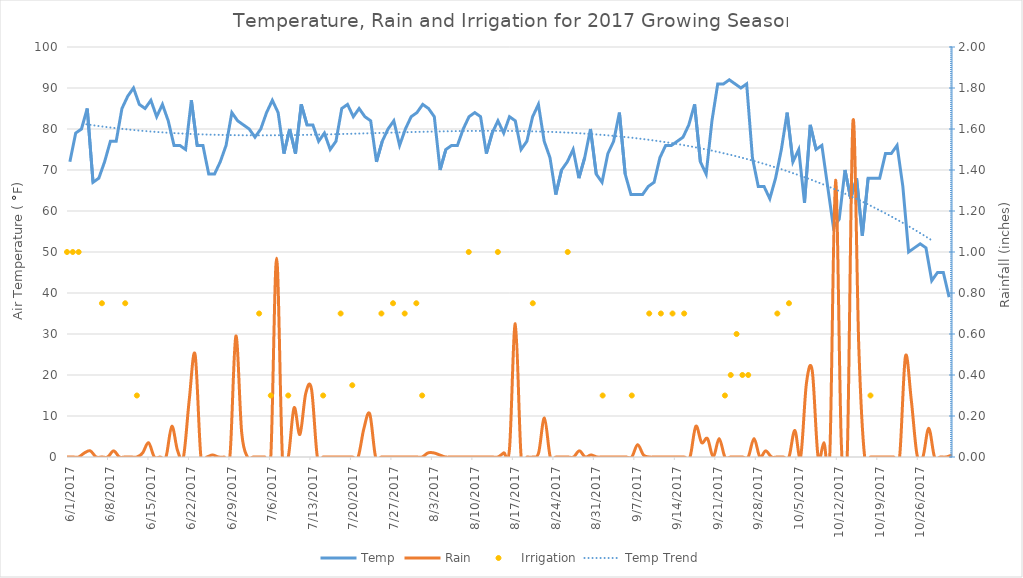
| Category | Temp |
|---|---|
| 6/1/17 | 72 |
| 6/2/17 | 79 |
| 6/3/17 | 80 |
| 6/4/17 | 85 |
| 6/5/17 | 67 |
| 6/6/17 | 68 |
| 6/7/17 | 72 |
| 6/8/17 | 77 |
| 6/9/17 | 77 |
| 6/10/17 | 85 |
| 6/11/17 | 88 |
| 6/12/17 | 90 |
| 6/13/17 | 86 |
| 6/14/17 | 85 |
| 6/15/17 | 87 |
| 6/16/17 | 83 |
| 6/17/17 | 86 |
| 6/18/17 | 82 |
| 6/19/17 | 76 |
| 6/20/17 | 76 |
| 6/21/17 | 75 |
| 6/22/17 | 87 |
| 6/23/17 | 76 |
| 6/24/17 | 76 |
| 6/25/17 | 69 |
| 6/26/17 | 69 |
| 6/27/17 | 72 |
| 6/28/17 | 76 |
| 6/29/17 | 84 |
| 6/30/17 | 82 |
| 7/1/17 | 81 |
| 7/2/17 | 80 |
| 7/3/17 | 78 |
| 7/4/17 | 80 |
| 7/5/17 | 84 |
| 7/6/17 | 87 |
| 7/7/17 | 84 |
| 7/8/17 | 74 |
| 7/9/17 | 80 |
| 7/10/17 | 74 |
| 7/11/17 | 86 |
| 7/12/17 | 81 |
| 7/13/17 | 81 |
| 7/14/17 | 77 |
| 7/15/17 | 79 |
| 7/16/17 | 75 |
| 7/17/17 | 77 |
| 7/18/17 | 85 |
| 7/19/17 | 86 |
| 7/20/17 | 83 |
| 7/21/17 | 85 |
| 7/22/17 | 83 |
| 7/23/17 | 82 |
| 7/24/17 | 72 |
| 7/25/17 | 77 |
| 7/26/17 | 80 |
| 7/27/17 | 82 |
| 7/28/17 | 76 |
| 7/29/17 | 80 |
| 7/30/17 | 83 |
| 7/31/17 | 84 |
| 8/1/17 | 86 |
| 8/2/17 | 85 |
| 8/3/17 | 83 |
| 8/4/17 | 70 |
| 8/5/17 | 75 |
| 8/6/17 | 76 |
| 8/7/17 | 76 |
| 8/8/17 | 80 |
| 8/9/17 | 83 |
| 8/10/17 | 84 |
| 8/11/17 | 83 |
| 8/12/17 | 74 |
| 8/13/17 | 79 |
| 8/14/17 | 82 |
| 8/15/17 | 79 |
| 8/16/17 | 83 |
| 8/17/17 | 82 |
| 8/18/17 | 75 |
| 8/19/17 | 77 |
| 8/20/17 | 83 |
| 8/21/17 | 86 |
| 8/22/17 | 77 |
| 8/23/17 | 73 |
| 8/24/17 | 64 |
| 8/25/17 | 70 |
| 8/26/17 | 72 |
| 8/27/17 | 75 |
| 8/28/17 | 68 |
| 8/29/17 | 73 |
| 8/30/17 | 80 |
| 8/31/17 | 69 |
| 9/1/17 | 67 |
| 9/2/17 | 74 |
| 9/3/17 | 77 |
| 9/4/17 | 84 |
| 9/5/17 | 69 |
| 9/6/17 | 64 |
| 9/7/17 | 64 |
| 9/8/17 | 64 |
| 9/9/17 | 66 |
| 9/10/17 | 67 |
| 9/11/17 | 73 |
| 9/12/17 | 76 |
| 9/13/17 | 76 |
| 9/14/17 | 77 |
| 9/15/17 | 78 |
| 9/16/17 | 81 |
| 9/17/17 | 86 |
| 9/18/17 | 72 |
| 9/19/17 | 69 |
| 9/20/17 | 82 |
| 9/21/17 | 91 |
| 9/22/17 | 91 |
| 9/23/17 | 92 |
| 9/24/17 | 91 |
| 9/25/17 | 90 |
| 9/26/17 | 91 |
| 9/27/17 | 73 |
| 9/28/17 | 66 |
| 9/29/17 | 66 |
| 9/30/17 | 63 |
| 10/1/17 | 68 |
| 10/2/17 | 75 |
| 10/3/17 | 84 |
| 10/4/17 | 72 |
| 10/5/17 | 75 |
| 10/6/17 | 62 |
| 10/7/17 | 81 |
| 10/8/17 | 75 |
| 10/9/17 | 76 |
| 10/10/17 | 66 |
| 10/11/17 | 56 |
| 10/12/17 | 58 |
| 10/13/17 | 70 |
| 10/14/17 | 63 |
| 10/15/17 | 68 |
| 10/16/17 | 54 |
| 10/17/17 | 68 |
| 10/18/17 | 68 |
| 10/19/17 | 68 |
| 10/20/17 | 74 |
| 10/21/17 | 74 |
| 10/22/17 | 76 |
| 10/23/17 | 66 |
| 10/24/17 | 50 |
| 10/25/17 | 51 |
| 10/26/17 | 52 |
| 10/27/17 | 51 |
| 10/28/17 | 43 |
| 10/29/17 | 45 |
| 10/30/17 | 45 |
| 10/31/17 | 39 |